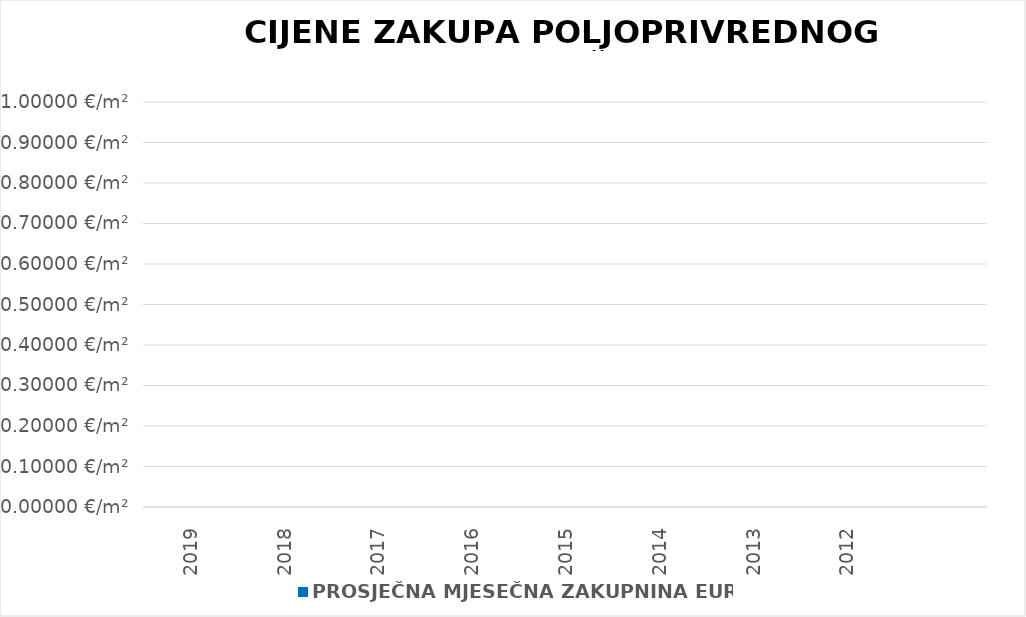
| Category | PROSJEČNA MJESEČNA ZAKUPNINA EUR/m2 |
|---|---|
| 2019 | 0 |
| 2018 | 0 |
| 2017 | 0 |
| 2016 | 0 |
| 2015 | 0 |
| 2014 | 0 |
| 2013 | 0 |
| 2012 | 0 |